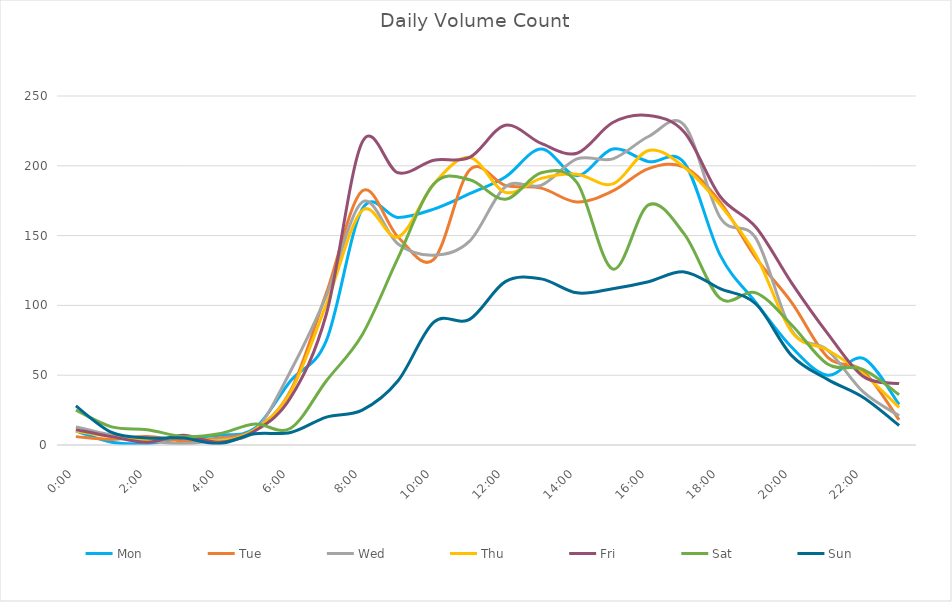
| Category | Mon | Tue | Wed | Thu | Fri | Sat | Sun |
|---|---|---|---|---|---|---|---|
| 0.0 | 10 | 6 | 13 | 10 | 11 | 25 | 28 |
| 0.0416666666666667 | 2 | 4 | 7 | 6 | 6 | 13 | 9 |
| 0.0833333333333333 | 1 | 6 | 3 | 3 | 2 | 11 | 5 |
| 0.125 | 5 | 3 | 1 | 6 | 7 | 6 | 5 |
| 0.166666666666667 | 7 | 5 | 4 | 3 | 2 | 8 | 1 |
| 0.208333333333333 | 12 | 11 | 10 | 11 | 10 | 15 | 8 |
| 0.25 | 46 | 39 | 53 | 38 | 34 | 12 | 9 |
| 0.291666666666667 | 75 | 109 | 107 | 101 | 94 | 46 | 20 |
| 0.333333333333333 | 169 | 182 | 174 | 168 | 217 | 79 | 25 |
| 0.375 | 163 | 149 | 144 | 149 | 195 | 134 | 46 |
| 0.416666666666667 | 169 | 133 | 136 | 187 | 204 | 187 | 88 |
| 0.4583333333333333 | 180 | 197 | 146 | 206 | 206 | 190 | 90 |
| 0.5 | 192 | 186 | 185 | 181 | 229 | 176 | 117 |
| 0.541666666666667 | 212 | 184 | 186 | 191 | 216 | 195 | 119 |
| 0.5833333333333334 | 193 | 174 | 205 | 194 | 209 | 188 | 109 |
| 0.625 | 212 | 182 | 205 | 187 | 231 | 126 | 112 |
| 0.666666666666667 | 203 | 198 | 221 | 211 | 236 | 172 | 117 |
| 0.7083333333333334 | 202 | 199 | 229 | 199 | 224 | 151 | 124 |
| 0.75 | 136 | 174 | 163 | 172 | 178 | 105 | 112 |
| 0.791666666666667 | 102 | 134 | 148 | 136 | 156 | 109 | 101 |
| 0.8333333333333334 | 70 | 102 | 82 | 81 | 116 | 86 | 64 |
| 0.875 | 50 | 63 | 68 | 68 | 80 | 58 | 47 |
| 0.916666666666667 | 62 | 53 | 38 | 51 | 49 | 54 | 34 |
| 0.9583333333333334 | 29 | 18 | 21 | 27 | 44 | 36 | 14 |